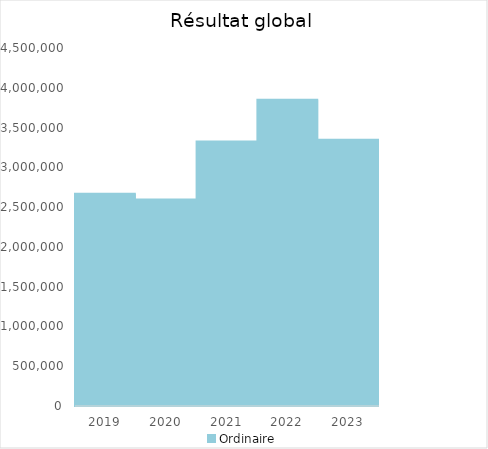
| Category |   | Ordinaire |    |
|---|---|---|---|
| 2019.0 |  | 2666724.67 |  |
| 2020.0 |  | 2595942.33 |  |
| 2021.0 |  | 3324501.8 |  |
| 2022.0 |  | 3848845.81 |  |
| 2023.0 |  | 3346498.21 |  |